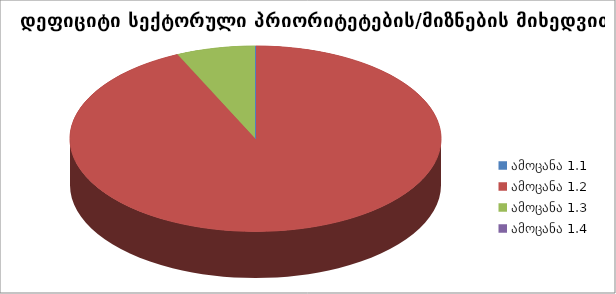
| Category |  დეფიციტი  |
|---|---|
| ამოცანა 1.1 | 0 |
| ამოცანა 1.2 | 2700000 |
| ამოცანა 1.3 | 200000 |
| ამოცანა 1.4 | 0 |